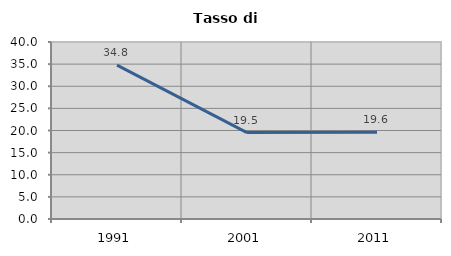
| Category | Tasso di disoccupazione   |
|---|---|
| 1991.0 | 34.776 |
| 2001.0 | 19.529 |
| 2011.0 | 19.582 |